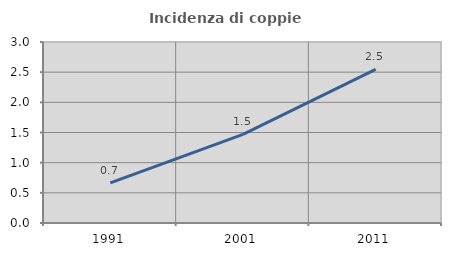
| Category | Incidenza di coppie miste |
|---|---|
| 1991.0 | 0.665 |
| 2001.0 | 1.469 |
| 2011.0 | 2.545 |